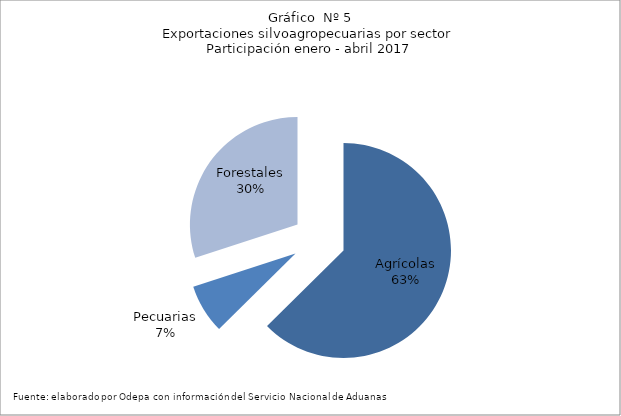
| Category | Series 0 |
|---|---|
| Agrícolas | 3184482 |
| Pecuarias | 376889 |
| Forestales | 1526552 |